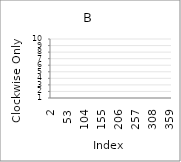
| Category | Series 0 |
|---|---|
| 2.0 | 3 |
| 3.0 | 1 |
| 4.0 | 5 |
| 5.0 | 1 |
| 6.0 | 7 |
| 7.0 | 7 |
| 8.0 | 1 |
| 9.0 | 1 |
| 10.0 | 7 |
| 11.0 | 4 |
| 12.0 | 6 |
| 13.0 | 6 |
| 14.0 | 9 |
| 15.0 | 8 |
| 16.0 | 6 |
| 17.0 | 5 |
| 18.0 | 7 |
| 19.0 | 5 |
| 20.0 | 6 |
| 21.0 | 10 |
| 22.0 | 6 |
| 23.0 | 5 |
| 24.0 | 10 |
| 25.0 | 1 |
| 26.0 | 9 |
| 27.0 | 10 |
| 28.0 | 3 |
| 29.0 | 7 |
| 30.0 | 7 |
| 31.0 | 5 |
| 32.0 | 4 |
| 33.0 | 8 |
| 34.0 | 9 |
| 35.0 | 7 |
| 36.0 | 7 |
| 37.0 | 6 |
| 38.0 | 10 |
| 39.0 | 9 |
| 40.0 | 9 |
| 41.0 | 3 |
| 42.0 | 4 |
| 43.0 | 8 |
| 44.0 | 10 |
| 45.0 | 4 |
| 46.0 | 2 |
| 47.0 | 4 |
| 48.0 | 5 |
| 49.0 | 6 |
| 50.0 | 6 |
| 51.0 | 3 |
| 52.0 | 4 |
| 53.0 | 3 |
| 54.0 | 5 |
| 55.0 | 6 |
| 56.0 | 8 |
| 57.0 | 8 |
| 58.0 | 9 |
| 59.0 | 9 |
| 60.0 | 8 |
| 61.0 | 5 |
| 62.0 | 3 |
| 63.0 | 2 |
| 64.0 | 6 |
| 65.0 | 10 |
| 66.0 | 2 |
| 67.0 | 4 |
| 68.0 | 6 |
| 69.0 | 6 |
| 70.0 | 4 |
| 71.0 | 1 |
| 72.0 | 6 |
| 73.0 | 8 |
| 74.0 | 9 |
| 75.0 | 8 |
| 76.0 | 8 |
| 77.0 | 6 |
| 78.0 | 3 |
| 79.0 | 10 |
| 80.0 | 2 |
| 81.0 | 5 |
| 82.0 | 5 |
| 83.0 | 7 |
| 84.0 | 2 |
| 85.0 | 9 |
| 86.0 | 2 |
| 87.0 | 9 |
| 88.0 | 8 |
| 89.0 | 3 |
| 90.0 | 9 |
| 91.0 | 8 |
| 92.0 | 8 |
| 93.0 | 1 |
| 94.0 | 5 |
| 95.0 | 5 |
| 96.0 | 6 |
| 97.0 | 9 |
| 98.0 | 3 |
| 99.0 | 2 |
| 100.0 | 7 |
| 101.0 | 7 |
| 102.0 | 1 |
| 103.0 | 7 |
| 104.0 | 3 |
| 105.0 | 2 |
| 106.0 | 5 |
| 107.0 | 3 |
| 108.0 | 9 |
| 109.0 | 1 |
| 110.0 | 2 |
| 111.0 | 7 |
| 112.0 | 7 |
| 113.0 | 3 |
| 114.0 | 2 |
| 115.0 | 8 |
| 116.0 | 1 |
| 117.0 | 5 |
| 118.0 | 6 |
| 119.0 | 2 |
| 120.0 | 7 |
| 121.0 | 6 |
| 122.0 | 1 |
| 123.0 | 1 |
| 124.0 | 6 |
| 125.0 | 2 |
| 126.0 | 1 |
| 127.0 | 7 |
| 128.0 | 9 |
| 129.0 | 3 |
| 130.0 | 7 |
| 131.0 | 4 |
| 132.0 | 10 |
| 133.0 | 4 |
| 134.0 | 5 |
| 135.0 | 7 |
| 136.0 | 6 |
| 137.0 | 9 |
| 138.0 | 9 |
| 139.0 | 2 |
| 140.0 | 6 |
| 141.0 | 9 |
| 142.0 | 7 |
| 143.0 | 9 |
| 144.0 | 4 |
| 145.0 | 3 |
| 146.0 | 4 |
| 147.0 | 1 |
| 148.0 | 3 |
| 149.0 | 4 |
| 150.0 | 9 |
| 151.0 | 4 |
| 152.0 | 10 |
| 153.0 | 9 |
| 154.0 | 8 |
| 155.0 | 2 |
| 156.0 | 4 |
| 157.0 | 4 |
| 158.0 | 7 |
| 159.0 | 4 |
| 160.0 | 1 |
| 161.0 | 3 |
| 162.0 | 10 |
| 163.0 | 9 |
| 164.0 | 6 |
| 165.0 | 8 |
| 166.0 | 4 |
| 167.0 | 4 |
| 168.0 | 2 |
| 169.0 | 6 |
| 170.0 | 10 |
| 171.0 | 7 |
| 172.0 | 10 |
| 173.0 | 5 |
| 174.0 | 10 |
| 175.0 | 7 |
| 176.0 | 4 |
| 177.0 | 2 |
| 178.0 | 7 |
| 179.0 | 4 |
| 180.0 | 6 |
| 181.0 | 2 |
| 182.0 | 2 |
| 183.0 | 6 |
| 184.0 | 9 |
| 185.0 | 8 |
| 186.0 | 9 |
| 187.0 | 2 |
| 188.0 | 4 |
| 189.0 | 2 |
| 190.0 | 9 |
| 191.0 | 6 |
| 192.0 | 4 |
| 193.0 | 3 |
| 194.0 | 9 |
| 195.0 | 8 |
| 196.0 | 2 |
| 197.0 | 2 |
| 198.0 | 1 |
| 199.0 | 10 |
| 200.0 | 7 |
| 201.0 | 1 |
| 202.0 | 4 |
| 203.0 | 8 |
| 204.0 | 10 |
| 205.0 | 8 |
| 206.0 | 10 |
| 207.0 | 8 |
| 208.0 | 10 |
| 209.0 | 9 |
| 210.0 | 2 |
| 211.0 | 3 |
| 212.0 | 6 |
| 213.0 | 8 |
| 214.0 | 5 |
| 215.0 | 4 |
| 216.0 | 6 |
| 217.0 | 7 |
| 218.0 | 6 |
| 219.0 | 7 |
| 220.0 | 2 |
| 221.0 | 7 |
| 222.0 | 4 |
| 223.0 | 8 |
| 224.0 | 5 |
| 225.0 | 6 |
| 226.0 | 9 |
| 227.0 | 2 |
| 228.0 | 1 |
| 229.0 | 2 |
| 230.0 | 8 |
| 231.0 | 9 |
| 232.0 | 8 |
| 233.0 | 6 |
| 234.0 | 6 |
| 235.0 | 5 |
| 236.0 | 3 |
| 237.0 | 10 |
| 238.0 | 10 |
| 239.0 | 2 |
| 240.0 | 10 |
| 241.0 | 9 |
| 242.0 | 3 |
| 243.0 | 10 |
| 244.0 | 4 |
| 245.0 | 1 |
| 246.0 | 10 |
| 247.0 | 6 |
| 248.0 | 1 |
| 249.0 | 3 |
| 250.0 | 2 |
| 251.0 | 8 |
| 252.0 | 10 |
| 253.0 | 9 |
| 254.0 | 9 |
| 255.0 | 5 |
| 256.0 | 6 |
| 257.0 | 10 |
| 258.0 | 10 |
| 259.0 | 10 |
| 260.0 | 3 |
| 261.0 | 1 |
| 262.0 | 3 |
| 263.0 | 1 |
| 264.0 | 7 |
| 265.0 | 5 |
| 266.0 | 8 |
| 267.0 | 6 |
| 268.0 | 1 |
| 269.0 | 5 |
| 270.0 | 5 |
| 271.0 | 4 |
| 272.0 | 4 |
| 273.0 | 6 |
| 274.0 | 4 |
| 275.0 | 9 |
| 276.0 | 1 |
| 277.0 | 4 |
| 278.0 | 2 |
| 279.0 | 3 |
| 280.0 | 5 |
| 281.0 | 6 |
| 282.0 | 7 |
| 283.0 | 9 |
| 284.0 | 2 |
| 285.0 | 9 |
| 286.0 | 3 |
| 287.0 | 5 |
| 288.0 | 4 |
| 289.0 | 10 |
| 290.0 | 4 |
| 291.0 | 1 |
| 292.0 | 5 |
| 293.0 | 9 |
| 294.0 | 8 |
| 295.0 | 1 |
| 296.0 | 7 |
| 297.0 | 7 |
| 298.0 | 9 |
| 299.0 | 6 |
| 300.0 | 5 |
| 301.0 | 2 |
| 302.0 | 3 |
| 303.0 | 3 |
| 304.0 | 6 |
| 305.0 | 1 |
| 306.0 | 2 |
| 307.0 | 2 |
| 308.0 | 2 |
| 309.0 | 4 |
| 310.0 | 6 |
| 311.0 | 5 |
| 312.0 | 1 |
| 313.0 | 3 |
| 314.0 | 9 |
| 315.0 | 10 |
| 316.0 | 10 |
| 317.0 | 8 |
| 318.0 | 1 |
| 319.0 | 8 |
| 320.0 | 3 |
| 321.0 | 6 |
| 322.0 | 9 |
| 323.0 | 6 |
| 324.0 | 10 |
| 325.0 | 4 |
| 326.0 | 3 |
| 327.0 | 1 |
| 328.0 | 3 |
| 329.0 | 10 |
| 330.0 | 5 |
| 331.0 | 7 |
| 332.0 | 5 |
| 333.0 | 1 |
| 334.0 | 5 |
| 335.0 | 5 |
| 336.0 | 10 |
| 337.0 | 5 |
| 338.0 | 9 |
| 339.0 | 1 |
| 340.0 | 7 |
| 341.0 | 7 |
| 342.0 | 5 |
| 343.0 | 3 |
| 344.0 | 3 |
| 345.0 | 5 |
| 346.0 | 1 |
| 347.0 | 2 |
| 348.0 | 7 |
| 349.0 | 9 |
| 350.0 | 9 |
| 351.0 | 5 |
| 352.0 | 3 |
| 353.0 | 8 |
| 354.0 | 4 |
| 355.0 | 4 |
| 356.0 | 6 |
| 357.0 | 2 |
| 358.0 | 1 |
| 359.0 | 5 |
| 360.0 | 3 |
| 361.0 | 9 |
| 362.0 | 3 |
| 363.0 | 6 |
| 364.0 | 6 |
| 365.0 | 10 |